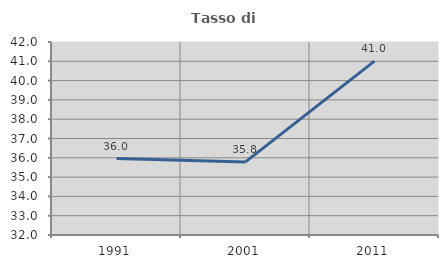
| Category | Tasso di occupazione   |
|---|---|
| 1991.0 | 35.959 |
| 2001.0 | 35.787 |
| 2011.0 | 41.006 |